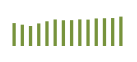
| Category | Saldo [ (1)-(2) ] |
|---|---|
| 0 | 532729.955 |
| 1 | 495602.949 |
| 2 | 464912.543 |
| 3 | 524886.84 |
| 4 | 575003.691 |
| 5 | 617133.535 |
| 6 | 598394.561 |
| 7 | 601130.812 |
| 8 | 618778.996 |
| 9 | 613783.089 |
| 10 | 640835.074 |
| 11 | 645614.486 |
| 12 | 650194 |
| 13 | 683486.094 |